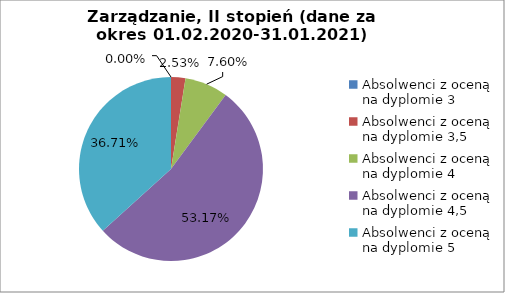
| Category | Series 0 |
|---|---|
| Absolwenci z oceną na dyplomie 3 | 0 |
| Absolwenci z oceną na dyplomie 3,5 | 2.532 |
| Absolwenci z oceną na dyplomie 4 | 7.595 |
| Absolwenci z oceną na dyplomie 4,5 | 53.165 |
| Absolwenci z oceną na dyplomie 5 | 36.709 |